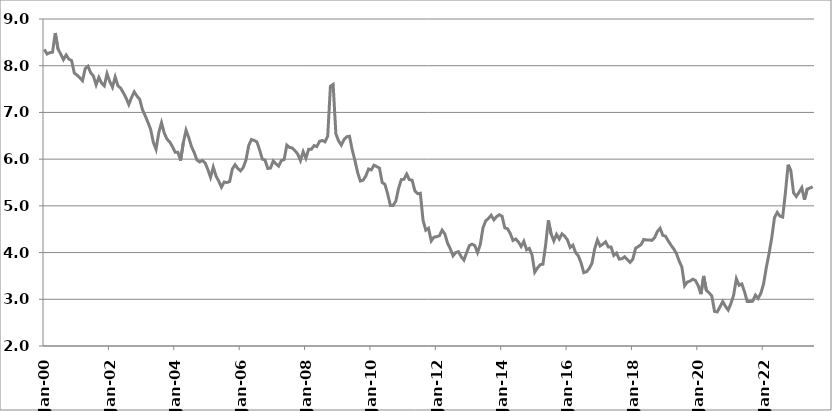
| Category | Series 1 |
|---|---|
| 2000-01-01 | 8.35 |
| 2000-02-01 | 8.25 |
| 2000-03-01 | 8.28 |
| 2000-04-01 | 8.29 |
| 2000-05-01 | 8.7 |
| 2000-06-01 | 8.36 |
| 2000-07-01 | 8.25 |
| 2000-08-01 | 8.13 |
| 2000-09-01 | 8.23 |
| 2000-10-01 | 8.14 |
| 2000-11-01 | 8.11 |
| 2000-12-01 | 7.84 |
| 2001-01-01 | 7.8 |
| 2001-02-01 | 7.74 |
| 2001-03-01 | 7.68 |
| 2001-04-01 | 7.94 |
| 2001-05-01 | 7.99 |
| 2001-06-01 | 7.85 |
| 2001-07-01 | 7.78 |
| 2001-08-01 | 7.59 |
| 2001-09-01 | 7.75 |
| 2001-10-01 | 7.63 |
| 2001-11-01 | 7.57 |
| 2001-12-01 | 7.83 |
| 2002-01-01 | 7.66 |
| 2002-02-01 | 7.54 |
| 2002-03-01 | 7.76 |
| 2002-04-01 | 7.57 |
| 2002-05-01 | 7.52 |
| 2002-06-01 | 7.42 |
| 2002-07-01 | 7.31 |
| 2002-08-01 | 7.17 |
| 2002-09-01 | 7.32 |
| 2002-10-01 | 7.44 |
| 2002-11-01 | 7.35 |
| 2002-12-01 | 7.28 |
| 2003-01-01 | 7.06 |
| 2003-02-01 | 6.93 |
| 2003-03-01 | 6.79 |
| 2003-04-01 | 6.64 |
| 2003-05-01 | 6.36 |
| 2003-06-01 | 6.21 |
| 2003-07-01 | 6.57 |
| 2003-08-01 | 6.78 |
| 2003-09-01 | 6.56 |
| 2003-10-01 | 6.43 |
| 2003-11-01 | 6.37 |
| 2003-12-01 | 6.27 |
| 2004-01-01 | 6.15 |
| 2004-02-01 | 6.15 |
| 2004-03-01 | 5.97 |
| 2004-04-01 | 6.35 |
| 2004-05-01 | 6.62 |
| 2004-06-01 | 6.46 |
| 2004-07-01 | 6.27 |
| 2004-08-01 | 6.14 |
| 2004-09-01 | 5.98 |
| 2004-10-01 | 5.94 |
| 2004-11-01 | 5.97 |
| 2004-12-01 | 5.92 |
| 2005-01-01 | 5.78 |
| 2005-02-01 | 5.61 |
| 2005-03-01 | 5.83 |
| 2005-04-01 | 5.64 |
| 2005-05-01 | 5.53 |
| 2005-06-01 | 5.4 |
| 2005-07-01 | 5.51 |
| 2005-08-01 | 5.5 |
| 2005-09-01 | 5.52 |
| 2005-10-01 | 5.79 |
| 2005-11-01 | 5.88 |
| 2005-12-01 | 5.8 |
| 2006-01-01 | 5.75 |
| 2006-02-01 | 5.82 |
| 2006-03-01 | 5.98 |
| 2006-04-01 | 6.29 |
| 2006-05-01 | 6.42 |
| 2006-06-01 | 6.4 |
| 2006-07-01 | 6.37 |
| 2006-08-01 | 6.2 |
| 2006-09-01 | 6 |
| 2006-10-01 | 5.98 |
| 2006-11-01 | 5.8 |
| 2006-12-01 | 5.81 |
| 2007-01-01 | 5.96 |
| 2007-02-01 | 5.9 |
| 2007-03-01 | 5.85 |
| 2007-04-01 | 5.97 |
| 2007-05-01 | 5.99 |
| 2007-06-01 | 6.3 |
| 2007-07-01 | 6.25 |
| 2007-08-01 | 6.24 |
| 2007-09-01 | 6.18 |
| 2007-10-01 | 6.11 |
| 2007-11-01 | 5.97 |
| 2007-12-01 | 6.16 |
| 2008-01-01 | 6.02 |
| 2008-02-01 | 6.21 |
| 2008-03-01 | 6.21 |
| 2008-04-01 | 6.29 |
| 2008-05-01 | 6.27 |
| 2008-06-01 | 6.38 |
| 2008-07-01 | 6.4 |
| 2008-08-01 | 6.37 |
| 2008-09-01 | 6.49 |
| 2008-10-01 | 7.56 |
| 2008-11-01 | 7.6 |
| 2008-12-01 | 6.54 |
| 2009-01-01 | 6.39 |
| 2009-02-01 | 6.3 |
| 2009-03-01 | 6.42 |
| 2009-04-01 | 6.48 |
| 2009-05-01 | 6.49 |
| 2009-06-01 | 6.2 |
| 2009-07-01 | 5.97 |
| 2009-08-01 | 5.71 |
| 2009-09-01 | 5.53 |
| 2009-10-01 | 5.55 |
| 2009-11-01 | 5.64 |
| 2009-12-01 | 5.79 |
| 2010-01-01 | 5.77 |
| 2010-02-01 | 5.87 |
| 2010-03-01 | 5.84 |
| 2010-04-01 | 5.81 |
| 2010-05-01 | 5.5 |
| 2010-06-01 | 5.46 |
| 2010-07-01 | 5.26 |
| 2010-08-01 | 5.01 |
| 2010-09-01 | 5.01 |
| 2010-10-01 | 5.1 |
| 2010-11-01 | 5.37 |
| 2010-12-01 | 5.56 |
| 2011-01-01 | 5.57 |
| 2011-02-01 | 5.68 |
| 2011-03-01 | 5.56 |
| 2011-04-01 | 5.55 |
| 2011-05-01 | 5.32 |
| 2011-06-01 | 5.26 |
| 2011-07-01 | 5.27 |
| 2011-08-01 | 4.69 |
| 2011-09-01 | 4.48 |
| 2011-10-01 | 4.52 |
| 2011-11-01 | 4.25 |
| 2011-12-01 | 4.33 |
| 2012-01-01 | 4.34 |
| 2012-02-01 | 4.36 |
| 2012-03-01 | 4.48 |
| 2012-04-01 | 4.4 |
| 2012-05-01 | 4.2 |
| 2012-06-01 | 4.08 |
| 2012-07-01 | 3.93 |
| 2012-08-01 | 4 |
| 2012-09-01 | 4.02 |
| 2012-10-01 | 3.91 |
| 2012-11-01 | 3.84 |
| 2012-12-01 | 4 |
| 2013-01-01 | 4.15 |
| 2013-02-01 | 4.18 |
| 2013-03-01 | 4.15 |
| 2013-04-01 | 4 |
| 2013-05-01 | 4.17 |
| 2013-06-01 | 4.53 |
| 2013-07-01 | 4.68 |
| 2013-08-01 | 4.73 |
| 2013-09-01 | 4.8 |
| 2013-10-01 | 4.7 |
| 2013-11-01 | 4.77 |
| 2013-12-01 | 4.81 |
| 2014-01-01 | 4.778 |
| 2014-02-01 | 4.53 |
| 2014-03-01 | 4.51 |
| 2014-04-01 | 4.41 |
| 2014-05-01 | 4.26 |
| 2014-06-01 | 4.29 |
| 2014-07-01 | 4.23 |
| 2014-08-01 | 4.13 |
| 2014-09-01 | 4.24 |
| 2014-10-01 | 4.06 |
| 2014-11-01 | 4.09 |
| 2014-12-01 | 3.95 |
| 2015-01-01 | 3.58 |
| 2015-02-01 | 3.67 |
| 2015-03-01 | 3.74 |
| 2015-04-01 | 3.75 |
| 2015-05-01 | 4.17 |
| 2015-06-01 | 4.69 |
| 2015-07-01 | 4.4 |
| 2015-08-01 | 4.25 |
| 2015-09-01 | 4.39 |
| 2015-10-01 | 4.29 |
| 2015-11-01 | 4.4 |
| 2015-12-01 | 4.35 |
| 2016-01-01 | 4.27 |
| 2016-02-01 | 4.11 |
| 2016-03-01 | 4.16 |
| 2016-04-01 | 4 |
| 2016-05-01 | 3.93 |
| 2016-06-01 | 3.78 |
| 2016-07-01 | 3.57 |
| 2016-08-01 | 3.59 |
| 2016-09-01 | 3.66 |
| 2016-10-01 | 3.77 |
| 2016-11-01 | 4.08 |
| 2016-12-01 | 4.27 |
| 2017-01-01 | 4.14 |
| 2017-02-01 | 4.18 |
| 2017-03-01 | 4.23 |
| 2017-04-01 | 4.12 |
| 2017-05-01 | 4.12 |
| 2017-06-01 | 3.94 |
| 2017-07-01 | 3.99 |
| 2017-08-01 | 3.86 |
| 2017-09-01 | 3.87 |
| 2017-10-01 | 3.91 |
| 2017-11-01 | 3.85 |
| 2017-12-01 | 3.79 |
| 2018-01-01 | 3.86 |
| 2018-02-01 | 4.09 |
| 2018-03-01 | 4.13 |
| 2018-04-01 | 4.17 |
| 2018-05-01 | 4.28 |
| 2018-06-01 | 4.27 |
| 2018-07-01 | 4.27 |
| 2018-08-01 | 4.26 |
| 2018-09-01 | 4.32 |
| 2018-10-01 | 4.45 |
| 2018-11-01 | 4.52 |
| 2018-12-01 | 4.37 |
| 2019-01-01 | 4.35 |
| 2019-02-01 | 4.25 |
| 2019-03-01 | 4.16 |
| 2019-04-01 | 4.08 |
| 2019-05-01 | 3.98 |
| 2019-06-01 | 3.82 |
| 2019-07-01 | 3.69 |
| 2019-08-01 | 3.29 |
| 2019-09-01 | 3.37 |
| 2019-10-01 | 3.39 |
| 2019-11-01 | 3.43 |
| 2019-12-01 | 3.4 |
| 2020-01-01 | 3.29 |
| 2020-02-01 | 3.11 |
| 2020-03-01 | 3.5 |
| 2020-04-01 | 3.19 |
| 2020-05-01 | 3.14 |
| 2020-06-01 | 3.07 |
| 2020-07-01 | 2.74 |
| 2020-08-01 | 2.73 |
| 2020-09-01 | 2.84 |
| 2020-10-01 | 2.95 |
| 2020-11-01 | 2.85 |
| 2020-12-01 | 2.77 |
| 2021-01-01 | 2.91 |
| 2021-02-01 | 3.09 |
| 2021-03-01 | 3.44 |
| 2021-04-01 | 3.3 |
| 2021-05-01 | 3.33 |
| 2021-06-01 | 3.16 |
| 2021-07-01 | 2.95 |
| 2021-08-01 | 2.95 |
| 2021-09-01 | 2.96 |
| 2021-10-01 | 3.09 |
| 2021-11-01 | 3.02 |
| 2021-12-01 | 3.13 |
| 2022-01-01 | 3.33 |
| 2022-02-01 | 3.68 |
| 2022-03-01 | 3.98 |
| 2022-04-01 | 4.32 |
| 2022-05-01 | 4.75 |
| 2022-06-01 | 4.86 |
| 2022-07-01 | 4.78 |
| 2022-08-01 | 4.76 |
| 2022-09-01 | 5.28 |
| 2022-10-01 | 5.88 |
| 2022-11-01 | 5.75 |
| 2022-12-01 | 5.28 |
| 2023-01-01 | 5.2 |
| 2023-02-01 | 5.29 |
| 2023-03-01 | 5.39 |
| 2023-04-01 | 5.13 |
| 2023-05-01 | 5.36 |
| 2023-06-01 | 5.38 |
| 2023-07-01 | 5.41 |